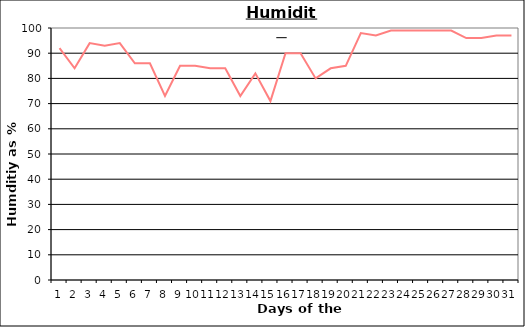
| Category | Series 0 |
|---|---|
| 0 | 92 |
| 1 | 84 |
| 2 | 94 |
| 3 | 93 |
| 4 | 94 |
| 5 | 86 |
| 6 | 86 |
| 7 | 73 |
| 8 | 85 |
| 9 | 85 |
| 10 | 84 |
| 11 | 84 |
| 12 | 73 |
| 13 | 82 |
| 14 | 71 |
| 15 | 90 |
| 16 | 90 |
| 17 | 80 |
| 18 | 84 |
| 19 | 85 |
| 20 | 98 |
| 21 | 97 |
| 22 | 99 |
| 23 | 99 |
| 24 | 99 |
| 25 | 99 |
| 26 | 99 |
| 27 | 96 |
| 28 | 96 |
| 29 | 97 |
| 30 | 97 |